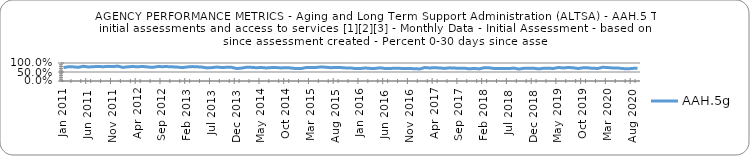
| Category | AAH.5g |
|---|---|
| 2011-01-01 | 0.744 |
| 2011-02-01 | 0.793 |
| 2011-03-01 | 0.785 |
| 2011-04-01 | 0.76 |
| 2011-05-01 | 0.819 |
| 2011-06-01 | 0.779 |
| 2011-07-01 | 0.793 |
| 2011-08-01 | 0.808 |
| 2011-09-01 | 0.792 |
| 2011-10-01 | 0.814 |
| 2011-11-01 | 0.8 |
| 2011-12-01 | 0.827 |
| 2012-01-01 | 0.754 |
| 2012-02-01 | 0.788 |
| 2012-03-01 | 0.806 |
| 2012-04-01 | 0.788 |
| 2012-05-01 | 0.809 |
| 2012-06-01 | 0.78 |
| 2012-07-01 | 0.758 |
| 2012-08-01 | 0.799 |
| 2012-09-01 | 0.798 |
| 2012-10-01 | 0.8 |
| 2012-11-01 | 0.788 |
| 2012-12-01 | 0.773 |
| 2013-01-01 | 0.743 |
| 2013-02-01 | 0.78 |
| 2013-03-01 | 0.8 |
| 2013-04-01 | 0.789 |
| 2013-05-01 | 0.77 |
| 2013-06-01 | 0.728 |
| 2013-07-01 | 0.744 |
| 2013-08-01 | 0.775 |
| 2013-09-01 | 0.747 |
| 2013-10-01 | 0.762 |
| 2013-11-01 | 0.759 |
| 2013-12-01 | 0.693 |
| 2014-01-01 | 0.718 |
| 2014-02-01 | 0.762 |
| 2014-03-01 | 0.757 |
| 2014-04-01 | 0.737 |
| 2014-05-01 | 0.752 |
| 2014-06-01 | 0.724 |
| 2014-07-01 | 0.746 |
| 2014-08-01 | 0.747 |
| 2014-09-01 | 0.725 |
| 2014-10-01 | 0.743 |
| 2014-11-01 | 0.723 |
| 2014-12-01 | 0.689 |
| 2015-01-01 | 0.688 |
| 2015-02-01 | 0.748 |
| 2015-03-01 | 0.752 |
| 2015-04-01 | 0.753 |
| 2015-05-01 | 0.778 |
| 2015-06-01 | 0.767 |
| 2015-07-01 | 0.738 |
| 2015-08-01 | 0.752 |
| 2015-09-01 | 0.748 |
| 2015-10-01 | 0.727 |
| 2015-11-01 | 0.729 |
| 2015-12-01 | 0.689 |
| 2016-01-01 | 0.693 |
| 2016-02-01 | 0.723 |
| 2016-03-01 | 0.701 |
| 2016-04-01 | 0.701 |
| 2016-05-01 | 0.732 |
| 2016-06-01 | 0.695 |
| 2016-07-01 | 0.694 |
| 2016-08-01 | 0.711 |
| 2016-09-01 | 0.702 |
| 2016-10-01 | 0.7 |
| 2016-11-01 | 0.692 |
| 2016-12-01 | 0.683 |
| 2017-01-01 | 0.67 |
| 2017-02-01 | 0.748 |
| 2017-03-01 | 0.725 |
| 2017-04-01 | 0.738 |
| 2017-05-01 | 0.724 |
| 2017-06-01 | 0.698 |
| 2017-07-01 | 0.731 |
| 2017-08-01 | 0.717 |
| 2017-09-01 | 0.708 |
| 2017-10-01 | 0.714 |
| 2017-11-01 | 0.676 |
| 2017-12-01 | 0.702 |
| 2018-01-01 | 0.672 |
| 2018-02-01 | 0.736 |
| 2018-03-01 | 0.732 |
| 2018-04-01 | 0.698 |
| 2018-05-01 | 0.701 |
| 2018-06-01 | 0.691 |
| 2018-07-01 | 0.689 |
| 2018-08-01 | 0.717 |
| 2018-09-01 | 0.664 |
| 2018-10-01 | 0.703 |
| 2018-11-01 | 0.708 |
| 2018-12-01 | 0.708 |
| 2019-01-01 | 0.673 |
| 2019-02-01 | 0.705 |
| 2019-03-01 | 0.708 |
| 2019-04-01 | 0.697 |
| 2019-05-01 | 0.751 |
| 2019-06-01 | 0.725 |
| 2019-07-01 | 0.751 |
| 2019-08-01 | 0.735 |
| 2019-09-01 | 0.692 |
| 2019-10-01 | 0.735 |
| 2019-11-01 | 0.731 |
| 2019-12-01 | 0.705 |
| 2020-01-01 | 0.698 |
| 2020-02-01 | 0.763 |
| 2020-03-01 | 0.746 |
| 2020-04-01 | 0.725 |
| 2020-05-01 | 0.723 |
| 2020-06-01 | 0.691 |
| 2020-07-01 | 0.674 |
| 2020-08-01 | 0.7 |
| 2020-09-01 | 0.714 |